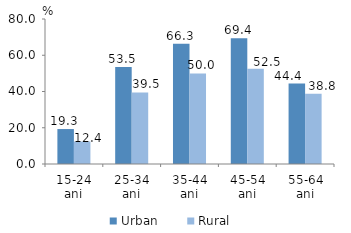
| Category | Urban | Rural |
|---|---|---|
| 15-24 ani | 19.281 | 12.413 |
| 25-34 ani | 53.467 | 39.465 |
| 35-44 ani | 66.282 | 49.977 |
| 45-54 ani | 69.44 | 52.488 |
| 55-64 ani | 44.442 | 38.792 |